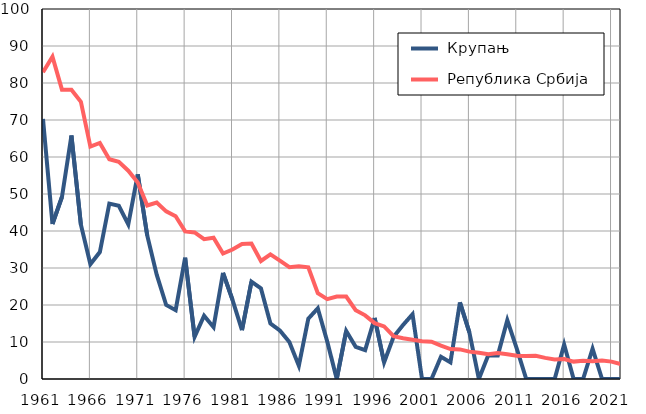
| Category |  Крупањ |  Република Србија |
|---|---|---|
| 1961.0 | 70.3 | 82.9 |
| 1962.0 | 41.9 | 87.1 |
| 1963.0 | 49.2 | 78.2 |
| 1964.0 | 65.8 | 78.2 |
| 1965.0 | 41.7 | 74.9 |
| 1966.0 | 31 | 62.8 |
| 1967.0 | 34.3 | 63.8 |
| 1968.0 | 47.4 | 59.4 |
| 1969.0 | 46.8 | 58.7 |
| 1970.0 | 41.8 | 56.3 |
| 1971.0 | 55.3 | 53.1 |
| 1972.0 | 38.8 | 46.9 |
| 1973.0 | 28.2 | 47.7 |
| 1974.0 | 20 | 45.3 |
| 1975.0 | 18.6 | 44 |
| 1976.0 | 32.8 | 39.9 |
| 1977.0 | 11.4 | 39.6 |
| 1978.0 | 17.1 | 37.8 |
| 1979.0 | 14 | 38.2 |
| 1980.0 | 28.7 | 33.9 |
| 1981.0 | 21.4 | 35 |
| 1982.0 | 13.2 | 36.5 |
| 1983.0 | 26.3 | 36.6 |
| 1984.0 | 24.5 | 31.9 |
| 1985.0 | 15 | 33.7 |
| 1986.0 | 13.1 | 32 |
| 1987.0 | 10 | 30.2 |
| 1988.0 | 3.6 | 30.5 |
| 1989.0 | 16.3 | 30.2 |
| 1990.0 | 19.1 | 23.2 |
| 1991.0 | 10.1 | 21.6 |
| 1992.0 | 0 | 22.3 |
| 1993.0 | 13 | 22.3 |
| 1994.0 | 8.7 | 18.6 |
| 1995.0 | 7.8 | 17.2 |
| 1996.0 | 16.5 | 15.1 |
| 1997.0 | 4.5 | 14.2 |
| 1998.0 | 11.4 | 11.6 |
| 1999.0 | 14.6 | 11 |
| 2000.0 | 17.5 | 10.6 |
| 2001.0 | 0 | 10.2 |
| 2002.0 | 0 | 10.1 |
| 2003.0 | 6 | 9 |
| 2004.0 | 4.5 | 8.1 |
| 2005.0 | 20.7 | 8 |
| 2006.0 | 12.6 | 7.4 |
| 2007.0 | 0 | 7.1 |
| 2008.0 | 6.5 | 6.7 |
| 2009.0 | 6.4 | 7 |
| 2010.0 | 15.9 | 6.7 |
| 2011.0 | 8.2 | 6.3 |
| 2012.0 | 0 | 6.2 |
| 2013.0 | 0 | 6.3 |
| 2014.0 | 0 | 5.7 |
| 2015.0 | 0 | 5.3 |
| 2016.0 | 9.3 | 5.4 |
| 2017.0 | 0 | 4.7 |
| 2018.0 | 0 | 4.9 |
| 2019.0 | 8.2 | 4.8 |
| 2020.0 | 0 | 5 |
| 2021.0 | 0 | 4.7 |
| 2022.0 | 0 | 4 |